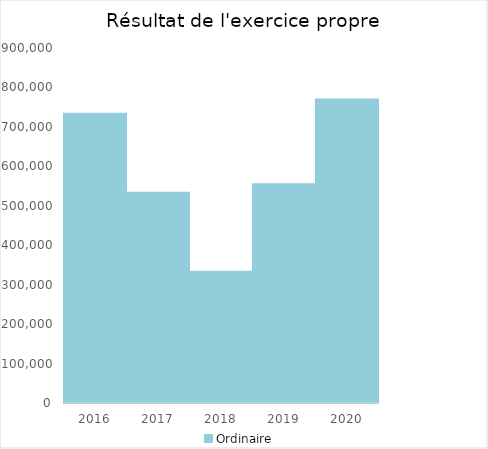
| Category |   | Ordinaire |    |
|---|---|---|---|
| 2016.0 |  | 733324.86 |  |
| 2017.0 |  | 532748.96 |  |
| 2018.0 |  | 332590.47 |  |
| 2019.0 |  | 554509.1 |  |
| 2020.0 |  | 769242.83 |  |